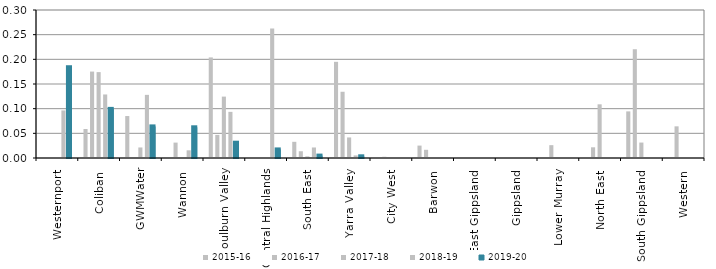
| Category | 2015-16 | 2016-17 | 2017-18 | 2018-19 | 2019-20 |
|---|---|---|---|---|---|
| Westernport  | 0 | 0 | 0 | 0.096 | 0.184 |
| Coliban  | 0.059 | 0.175 | 0.174 | 0.129 | 0.1 |
| GWMWater | 0.085 | 0 | 0.021 | 0.128 | 0.064 |
| Wannon  | 0 | 0.031 | 0 | 0.016 | 0.062 |
| Goulburn Valley  | 0.204 | 0.047 | 0.124 | 0.094 | 0.031 |
| Central Highlands  | 0 | 0 | 0 | 0.262 | 0.017 |
| South East  | 0.033 | 0.014 | 0.003 | 0.021 | 0.005 |
| Yarra Valley  | 0.195 | 0.134 | 0.042 | 0.005 | 0.003 |
| City West  | 0 | 0.002 | 0 | 0 | 0 |
| Barwon  | 0.025 | 0.017 | 0 | 0 | 0 |
| East Gippsland  | 0 | 0 | 0 | 0 | 0 |
| Gippsland  | 0 | 0 | 0 | 0 | 0 |
| Lower Murray  | 0 | 0.026 | 0 | 0 | 0 |
| North East  | 0 | 0.022 | 0.109 | 0 | 0 |
| South Gippsland  | 0.094 | 0.22 | 0.031 | 0 | 0 |
| Western  | 0 | 0.064 | 0 | 0 | 0 |